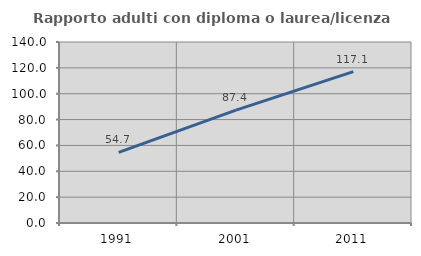
| Category | Rapporto adulti con diploma o laurea/licenza media  |
|---|---|
| 1991.0 | 54.652 |
| 2001.0 | 87.352 |
| 2011.0 | 117.123 |